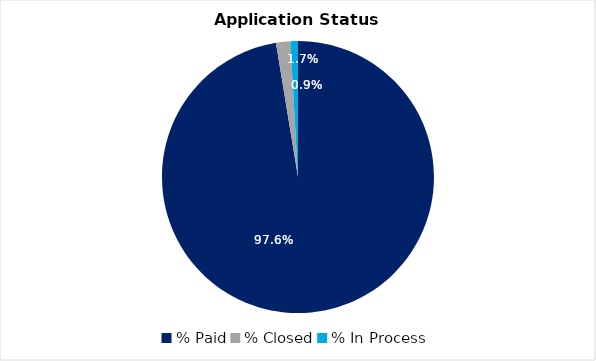
| Category | Series 0 |
|---|---|
| % Paid | 0.976 |
| % Closed | 0.017 |
| % In Process | 0.009 |